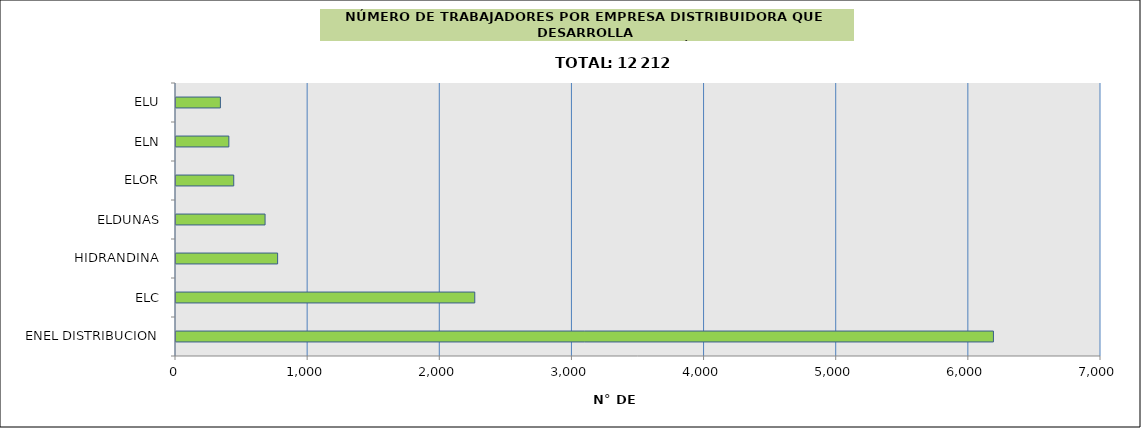
| Category | Series 0 |
|---|---|
| ENEL DISTRIBUCION | 6186 |
| ELC | 2261 |
| HIDRANDINA | 769 |
| ELDUNAS | 674 |
| ELOR | 437 |
| ELN | 400 |
| ELU | 336 |